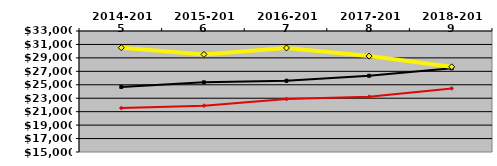
| Category | NATIONAL MEDIAN | WEST MEDIAN | TEXAS LUTHERAN |
|---|---|---|---|
| 2014-2015 | 24676.206 | 21538.641 | 30515.957 |
| 2015-2016 | 25364.205 | 21894.382 | 29513.209 |
| 2016-2017 | 25597.574 | 22877.336 | 30475.146 |
| 2017-2018 | 26342.841 | 23225.377 | 29264.768 |
| 2018-2019 | 27452.913 | 24453.997 | 27668.054 |